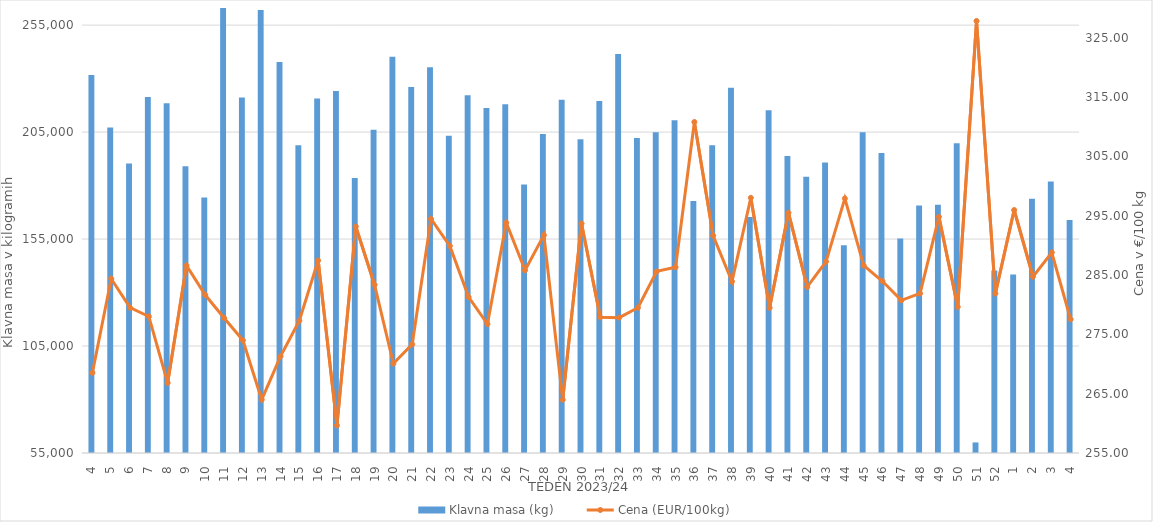
| Category | Klavna masa (kg) |
|---|---|
| 4.0 | 231737 |
| 5.0 | 207136 |
| 6.0 | 190311 |
| 7.0 | 221366 |
| 8.0 | 218470 |
| 9.0 | 189006 |
| 10.0 | 174425 |
| 11.0 | 265476 |
| 12.0 | 221171 |
| 13.0 | 262102 |
| 14.0 | 237813 |
| 15.0 | 198828 |
| 16.0 | 220686 |
| 17.0 | 224192 |
| 18.0 | 183508 |
| 19.0 | 206133 |
| 20.0 | 240223 |
| 21.0 | 226050 |
| 22.0 | 235273 |
| 23.0 | 203306 |
| 24.0 | 222178 |
| 25.0 | 216259 |
| 26.0 | 218064 |
| 27.0 | 180556 |
| 28.0 | 204078 |
| 29.0 | 220162 |
| 30.0 | 201649 |
| 31.0 | 219538 |
| 32.0 | 241549 |
| 33.0 | 202261 |
| 34.0 | 204903 |
| 35.0 | 210575 |
| 36.0 | 172745 |
| 37.0 | 198877 |
| 38.0 | 225730 |
| 39.0 | 165273 |
| 40.0 | 215175 |
| 41.0 | 193769 |
| 42.0 | 184122 |
| 43.0 | 190834 |
| 44.0 | 152119 |
| 45.0 | 204974 |
| 46.0 | 195179 |
| 47.0 | 155300 |
| 48.0 | 170687 |
| 49.0 | 171040 |
| 50.0 | 199802 |
| 51.0 | 59936 |
| 52.0 | 140361 |
| 1.0 | 138450 |
| 2.0 | 173833 |
| 3.0 | 181907 |
| 4.0 | 163901 |